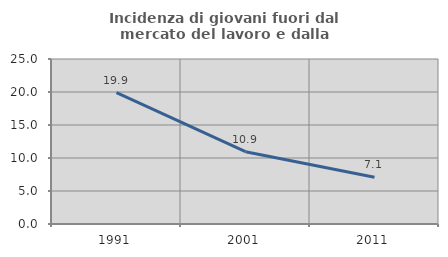
| Category | Incidenza di giovani fuori dal mercato del lavoro e dalla formazione  |
|---|---|
| 1991.0 | 19.89 |
| 2001.0 | 10.949 |
| 2011.0 | 7.08 |